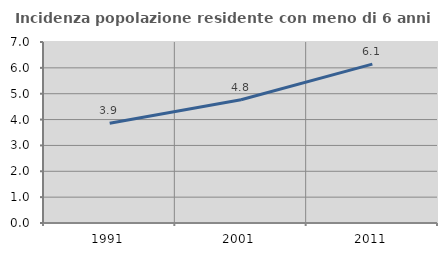
| Category | Incidenza popolazione residente con meno di 6 anni |
|---|---|
| 1991.0 | 3.856 |
| 2001.0 | 4.767 |
| 2011.0 | 6.145 |